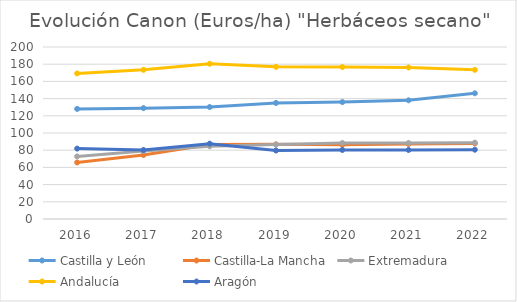
| Category | Castilla y León | Castilla-La Mancha | Extremadura | Andalucía | Aragón |
|---|---|---|---|---|---|
| 2016.0 | 128.006 | 65.75 | 72.724 | 169.282 | 81.869 |
| 2017.0 | 128.909 | 74.381 | 79.029 | 173.423 | 80.273 |
| 2018.0 | 130.168 | 86.548 | 84.514 | 180.543 | 87.591 |
| 2019.0 | 134.968 | 86.833 | 86.536 | 176.928 | 79.635 |
| 2020.0 | 135.978 | 86.256 | 88.36 | 176.642 | 80.281 |
| 2021.0 | 138.036 | 87.087 | 88.36 | 176.193 | 80.281 |
| 2022.0 | 146.178 | 87.864 | 88.752 | 173.451 | 80.577 |